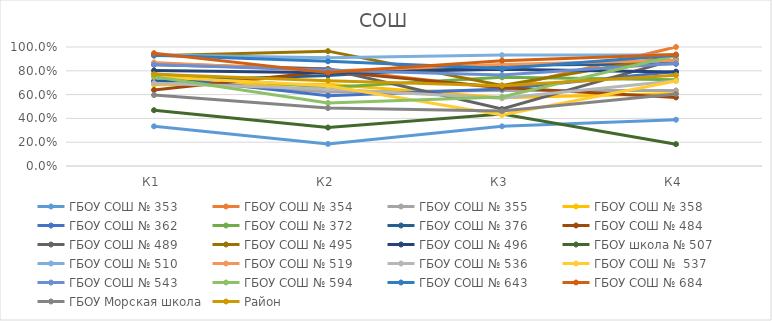
| Category | ГБОУ СОШ № 353 | ГБОУ СОШ № 354 | ГБОУ СОШ № 355 | ГБОУ СОШ № 358 | ГБОУ СОШ № 362 | ГБОУ СОШ № 372 | ГБОУ СОШ № 376 | ГБОУ СОШ № 484 | ГБОУ СОШ № 489 | ГБОУ СОШ № 495 | ГБОУ СОШ № 496 | ГБОУ школа № 507 | ГБОУ СОШ № 510 | ГБОУ СОШ № 519 | ГБОУ СОШ № 536 | ГБОУ СОШ №  537 | ГБОУ СОШ № 543 | ГБОУ СОШ № 594 | ГБОУ СОШ № 643 | ГБОУ СОШ № 684 | ГБОУ Морская школа | Район |
|---|---|---|---|---|---|---|---|---|---|---|---|---|---|---|---|---|---|---|---|---|---|---|
| К1 | 0.333 | 0.861 | 0.716 | 0.683 | 0.753 | 0.776 | 0.712 | 0.639 | 0.85 | 0.927 | 0.802 | 0.469 | 0.932 | 0.871 | 0.696 | 0.75 | 0.853 | 0.75 | 0.931 | 0.948 | 0.596 | 0.771 |
| К2 | 0.185 | 0.815 | 0.622 | 0.687 | 0.591 | 0.66 | 0.761 | 0.796 | 0.814 | 0.965 | 0.783 | 0.323 | 0.909 | 0.799 | 0.647 | 0.675 | 0.804 | 0.53 | 0.879 | 0.785 | 0.487 | 0.717 |
| К3 | 0.333 | 0.653 | 0.635 | 0.573 | 0.647 | 0.745 | 0.847 | 0.66 | 0.479 | 0.677 | 0.814 | 0.438 | 0.932 | 0.853 | 0.569 | 0.429 | 0.765 | 0.58 | 0.819 | 0.885 | 0.462 | 0.675 |
| К4 | 0.389 | 1 | 0.635 | 0.61 | 0.793 | 0.724 | 0.859 | 0.576 | 0.896 | 0.927 | 0.791 | 0.184 | 0.932 | 0.888 | 0.716 | 0.714 | 0.863 | 0.929 | 0.931 | 0.938 | 0.606 | 0.763 |